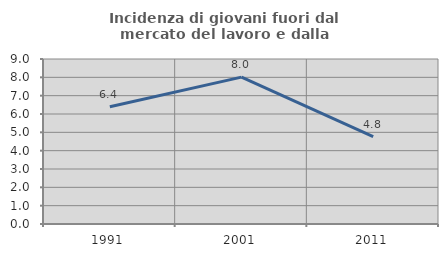
| Category | Incidenza di giovani fuori dal mercato del lavoro e dalla formazione  |
|---|---|
| 1991.0 | 6.394 |
| 2001.0 | 8.012 |
| 2011.0 | 4.762 |